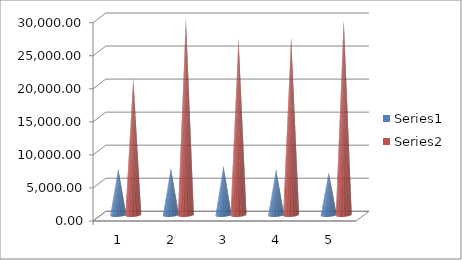
| Category | Series 0 | Series 1 |
|---|---|---|
| 0 | 7001.4 | 20622.99 |
| 1 | 7082.54 | 29680.81 |
| 2 | 7415.25 | 26640.22 |
| 3 | 6884.35 | 26805.45 |
| 4 | 6447.27 | 29429.2 |